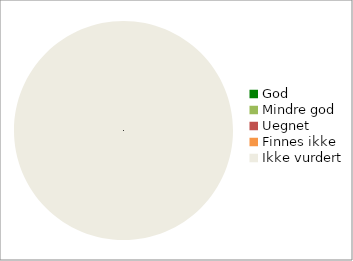
| Category | Series 0 |
|---|---|
| God | 0 |
| Mindre god | 0 |
| Uegnet | 0 |
| Finnes ikke | 0 |
| Ikke vurdert | 160 |